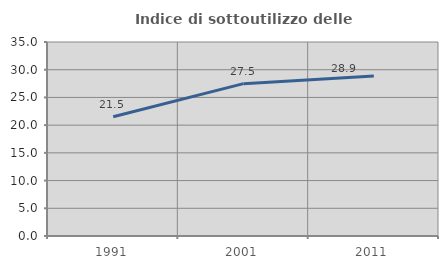
| Category | Indice di sottoutilizzo delle abitazioni  |
|---|---|
| 1991.0 | 21.507 |
| 2001.0 | 27.483 |
| 2011.0 | 28.881 |